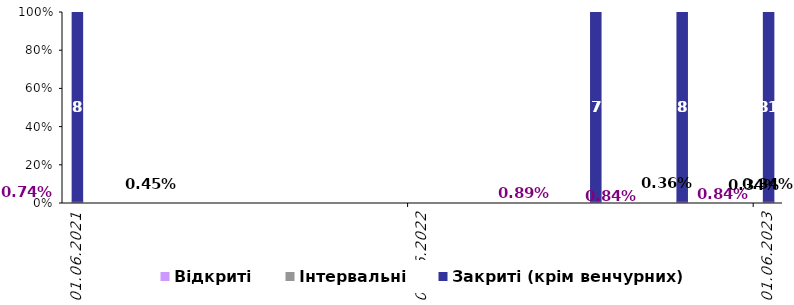
| Category | Відкриті | Інтервальні | Закриті (крім венчурних) |
|---|---|---|---|
| 2021-06-30 | 0.007 | 0.005 | 0.988 |
| 2022-12-31 | 0.009 | 0.004 | 0.988 |
| 2023-03-31 | 0.008 | 0.003 | 0.988 |
| 2023-06-30 | 0.008 | 0.003 | 0.988 |